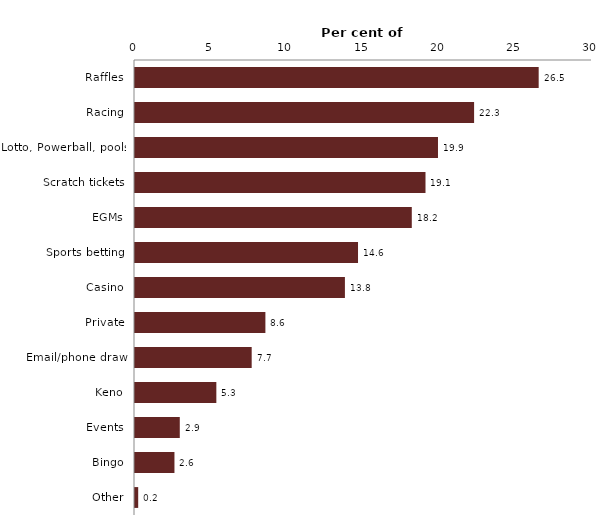
| Category | Series 0 |
|---|---|
| Raffles | 26.5 |
| Racing | 22.26 |
| Lotto, Powerball, pools | 19.89 |
| Scratch tickets | 19.07 |
| EGMs | 18.17 |
| Sports betting | 14.64 |
| Casino | 13.78 |
| Private | 8.56 |
| Email/phone draw | 7.66 |
| Keno | 5.34 |
| Events | 2.94 |
| Bingo | 2.59 |
| Other | 0.21 |